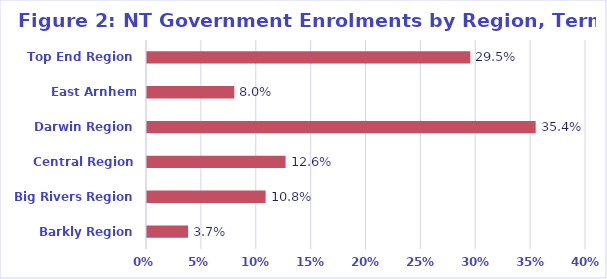
| Category | % |
|---|---|
| Barkly Region | 0.037 |
| Big Rivers Region | 0.108 |
| Central Region | 0.126 |
| Darwin Region | 0.354 |
| East Arnhem Region | 0.08 |
| Top End Region | 0.295 |